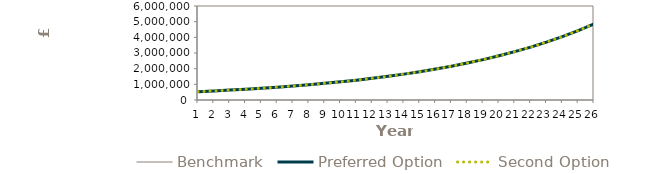
| Category | Benchmark | Preferred Option | Second Option |
|---|---|---|---|
| 0 | 531951.21 | 531951.21 | 531951.21 |
| 1 | 579549.087 | 579549.087 | 579549.087 |
| 2 | 631570.917 | 631570.917 | 631570.917 |
| 3 | 688438.945 | 688438.945 | 688438.945 |
| 4 | 750616.433 | 750616.433 | 750616.433 |
| 5 | 818611.684 | 818611.684 | 818611.684 |
| 6 | 892982.478 | 892982.478 | 892982.478 |
| 7 | 974340.928 | 974340.928 | 974340.928 |
| 8 | 1063358.835 | 1063358.835 | 1063358.835 |
| 9 | 1160773.562 | 1160773.562 | 1160773.562 |
| 10 | 1267394.493 | 1267394.493 | 1267394.493 |
| 11 | 1384110.13 | 1384110.13 | 1384110.13 |
| 12 | 1511895.903 | 1511895.903 | 1511895.903 |
| 13 | 1651822.739 | 1651822.739 | 1651822.739 |
| 14 | 1805066.493 | 1805066.493 | 1805066.493 |
| 15 | 1972918.311 | 1972918.311 | 1972918.311 |
| 16 | 2156796.021 | 2156796.021 | 2156796.021 |
| 17 | 2358256.655 | 2358256.655 | 2358256.655 |
| 18 | 2579010.214 | 2579010.214 | 2579010.214 |
| 19 | 2820934.803 | 2820934.803 | 2820934.803 |
| 20 | 3086093.265 | 3086093.265 | 3086093.265 |
| 21 | 3376751.471 | 3376751.471 | 3376751.471 |
| 22 | 3695398.431 | 3695398.431 | 3695398.431 |
| 23 | 4044768.396 | 4044768.396 | 4044768.396 |
| 24 | 4427865.165 | 4427865.165 | 4427865.165 |
| 25 | 4847988.807 | 4847988.807 | 4847988.807 |